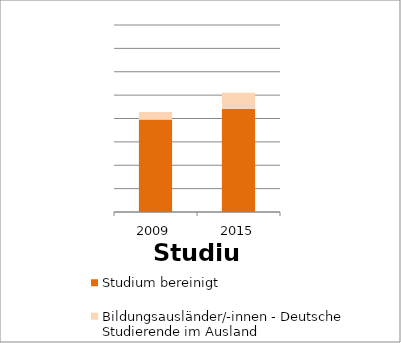
| Category | Studium bereinigt | Bildungsausländer/-innen - Deutsche Studierende im Ausland |
|---|---|---|
| 2009.0 | 395966 | 32034 |
| 2015.0 | 441021 | 68800 |